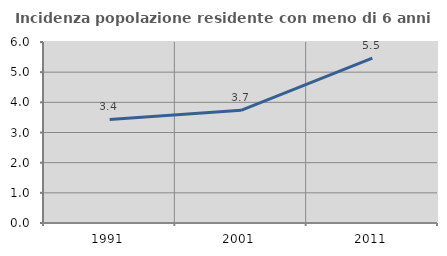
| Category | Incidenza popolazione residente con meno di 6 anni |
|---|---|
| 1991.0 | 3.434 |
| 2001.0 | 3.736 |
| 2011.0 | 5.464 |